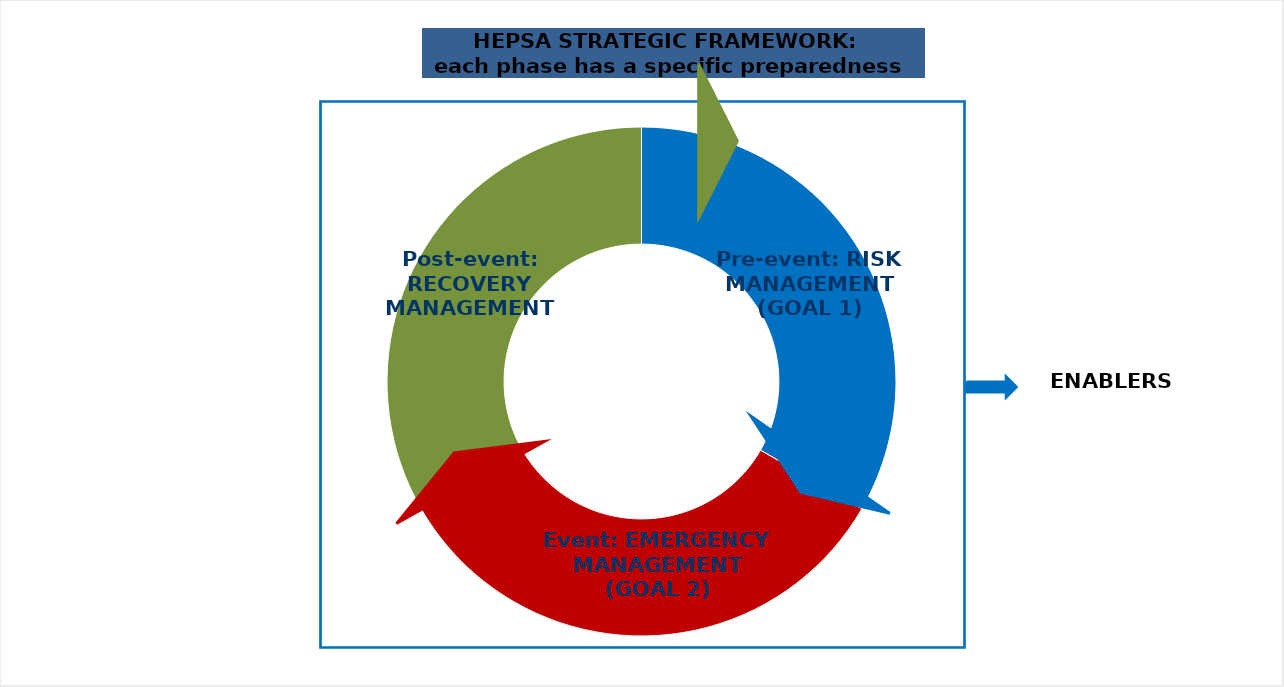
| Category | Series 0 |
|---|---|
| Pre-event: RISK MANAGEMENT (GOAL 1) | 1 |
| Event: EMERGENCY MANAGEMENT (GOAL 2) | 1 |
| Post-event: RECOVERY MANAGEMENT (GOAL 3) | 1 |